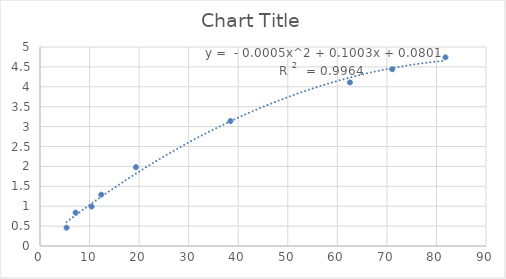
| Category | Series 0 |
|---|---|
| 5.36 | 0.46 |
| 12.36 | 1.29 |
| 81.82 | 4.74 |
| 62.54 | 4.11 |
| 10.41 | 0.99 |
| 38.43 | 3.14 |
| 7.18 | 0.84 |
| 19.36 | 1.98 |
| 71.07 | 4.44 |